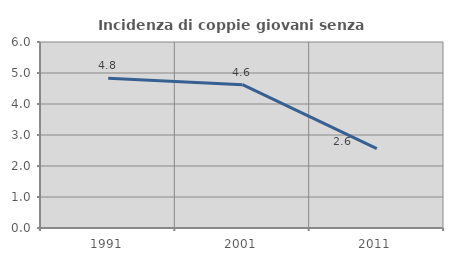
| Category | Incidenza di coppie giovani senza figli |
|---|---|
| 1991.0 | 4.833 |
| 2001.0 | 4.624 |
| 2011.0 | 2.562 |